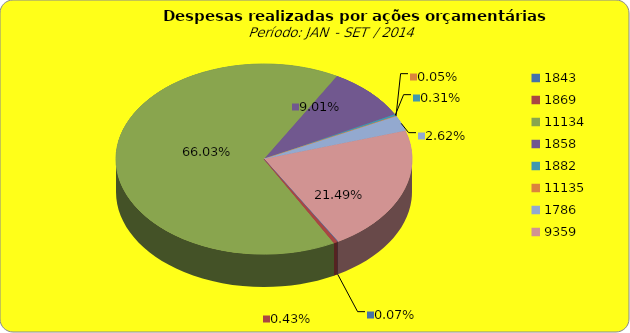
| Category | Series 1 |
|---|---|
| 1843.0 | 100000 |
| 1869.0 | 628423.79 |
| 11134.0 | 97404303.06 |
| 1858.0 | 13284196.69 |
| 1882.0 | 460659.2 |
| 11135.0 | 75213.95 |
| 1786.0 | 3864992.96 |
| 9359.0 | 31693911.76 |